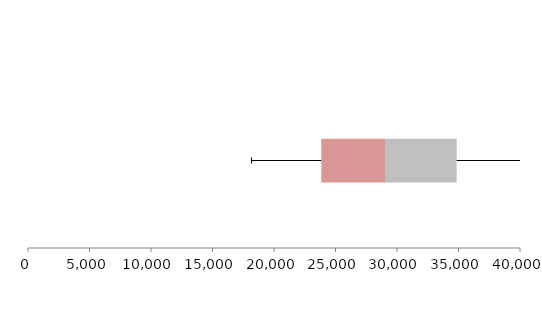
| Category | Series 1 | Series 2 | Series 3 |
|---|---|---|---|
| 0 | 23842.759 | 5183.891 | 5823.299 |